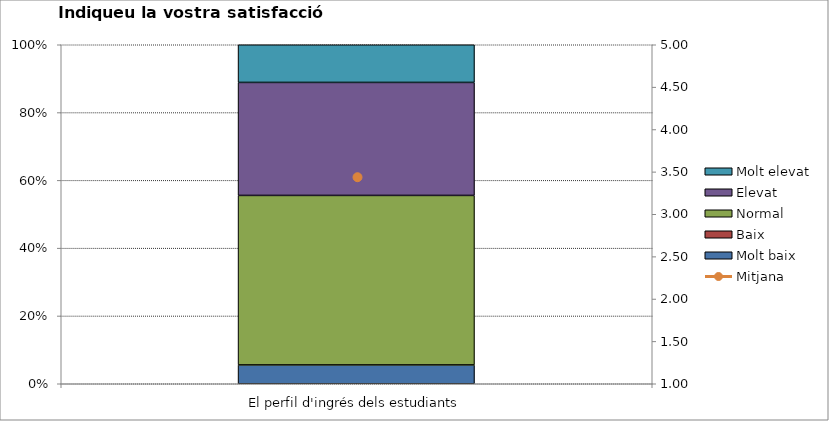
| Category | Molt baix | Baix | Normal  | Elevat | Molt elevat |
|---|---|---|---|---|---|
| El perfil d'ingrés dels estudiants | 1 | 0 | 9 | 6 | 2 |